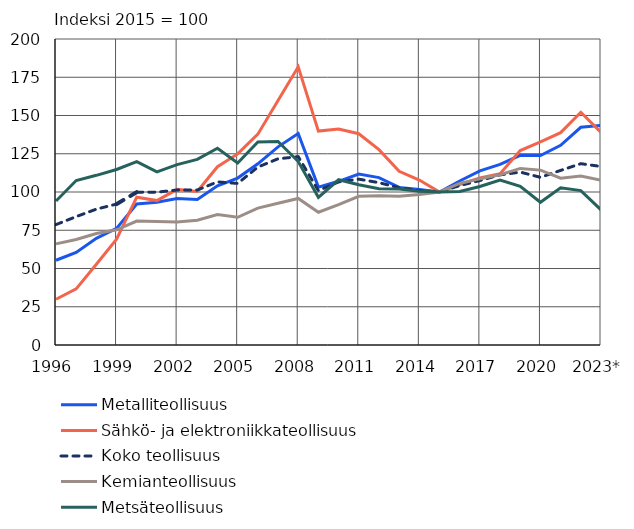
| Category | Metalliteollisuus | Sähkö- ja elektroniikkateollisuus | Koko teollisuus | Kemianteollisuus | Metsäteollisuus |
|---|---|---|---|---|---|
| 1996 | 55.4 | 29.9 | 78.7 | 66.1 | 94.1 |
| 1997 | 60.5 | 36.7 | 83.9 | 69 | 107.5 |
| 1998 | 69.7 | 52.8 | 88.8 | 72.9 | 110.9 |
| 1999 | 76.2 | 69.2 | 92.1 | 75.3 | 114.7 |
| 2000 | 92.2 | 96.6 | 99.9 | 81 | 119.9 |
| 2001 | 93.3 | 94.4 | 99.9 | 80.7 | 113.1 |
| 2002 | 95.7 | 101.7 | 101.3 | 80.4 | 117.9 |
| 2003 | 95.1 | 100.4 | 101.3 | 81.6 | 121.3 |
| 2004 | 104 | 116.5 | 106.6 | 85.3 | 128.6 |
| 2005 | 109.1 | 124.9 | 105.6 | 83.5 | 119 |
| 2006 | 118.4 | 137.8 | 116.3 | 89.5 | 132.7 |
| 2007 | 129.5 | 159.8 | 121.7 | 92.6 | 133 |
| 2008 | 138.2 | 181.8 | 123.1 | 95.8 | 119.9 |
| 2009 | 103.2 | 139.8 | 100.9 | 86.8 | 96.5 |
| 2010 | 107 | 141.2 | 106.6 | 91.8 | 108 |
| 2011 | 111.7 | 138.1 | 108.4 | 97.2 | 104.7 |
| 2012 | 109.4 | 127.7 | 106.1 | 97.5 | 102.1 |
| 2013 | 103 | 113.5 | 102.8 | 97.2 | 102 |
| 2014 | 101.6 | 107.8 | 100.9 | 98.4 | 100.5 |
| 2015 | 100 | 100 | 100 | 100 | 100 |
| 2016 | 107.2 | 104.9 | 104.2 | 105.6 | 100.4 |
| 2017 | 113.8 | 109.2 | 107.5 | 108.6 | 103.6 |
| 2018 | 118 | 112 | 111.2 | 111.3 | 107.8 |
| 2019 | 124 | 127.1 | 113 | 115.4 | 103.7 |
| 2020 | 123.8 | 132.8 | 109.6 | 114.3 | 93.3 |
| 2021 | 130.5 | 138.8 | 114.1 | 109 | 102.8 |
| 2022 | 142.3 | 152.1 | 118.5 | 110.4 | 100.9 |
| 2023* | 143.5 | 138.9 | 116.7 | 107.7 | 88.3 |